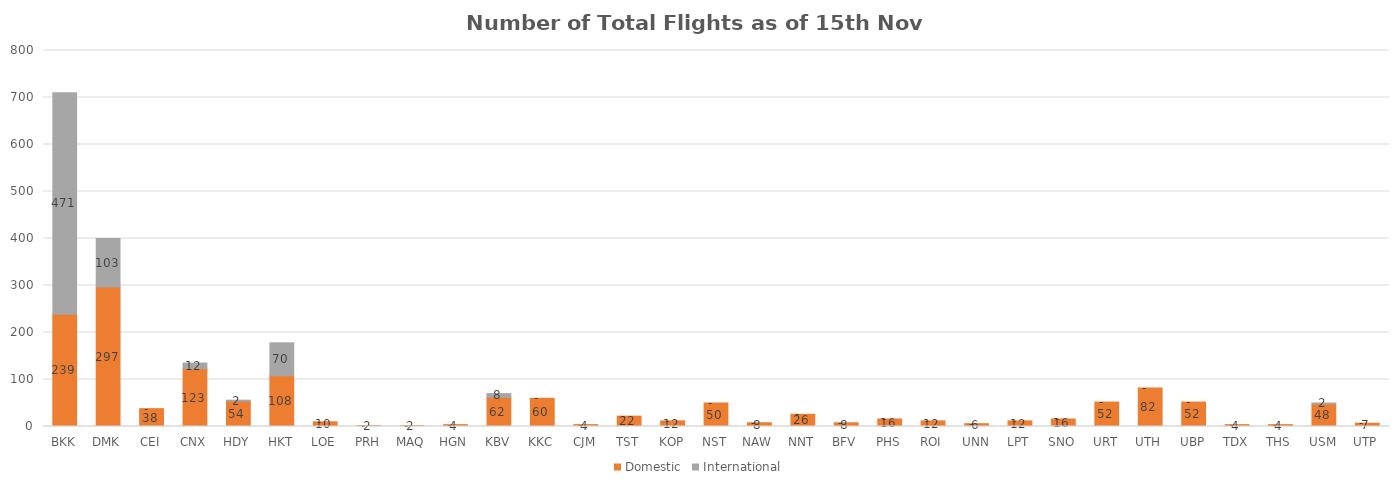
| Category | Domestic | International |
|---|---|---|
| BKK | 239 | 471 |
| DMK | 297 | 103 |
| CEI | 38 | 0 |
| CNX | 123 | 12 |
| HDY | 54 | 2 |
| HKT | 108 | 70 |
| LOE | 10 | 0 |
| PRH | 2 | 0 |
| MAQ | 2 | 0 |
| HGN | 4 | 0 |
| KBV | 62 | 8 |
| KKC | 60 | 0 |
| CJM | 4 | 0 |
| TST | 22 | 0 |
| KOP | 12 | 0 |
| NST | 50 | 0 |
| NAW | 8 | 0 |
| NNT | 26 | 0 |
| BFV | 8 | 0 |
| PHS | 16 | 0 |
| ROI | 12 | 0 |
| UNN | 6 | 0 |
| LPT | 12 | 0 |
| SNO | 16 | 0 |
| URT | 52 | 0 |
| UTH | 82 | 0 |
| UBP | 52 | 0 |
| TDX | 4 | 0 |
| THS | 4 | 0 |
| USM | 48 | 2 |
| UTP | 7 | 0 |